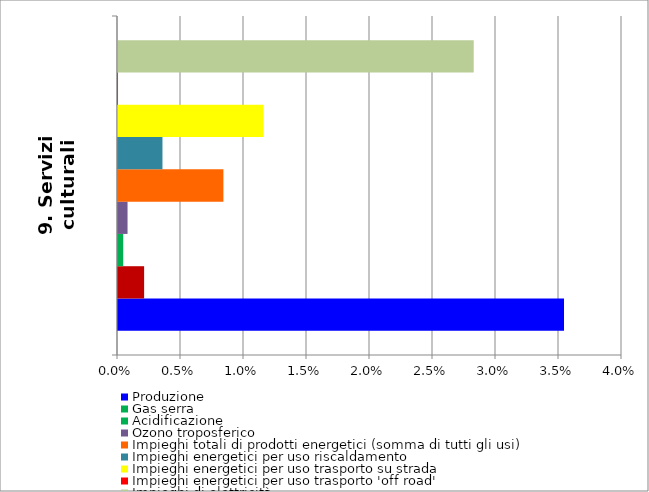
| Category | Produzione | Gas serra | Acidificazione | Ozono troposferico | Impieghi totali di prodotti energetici (somma di tutti gli usi) | Impieghi energetici per uso riscaldamento | Impieghi energetici per uso trasporto su strada | Impieghi energetici per uso trasporto 'off road' | Impieghi di elettricità |
|---|---|---|---|---|---|---|---|---|---|
| 9. Servizi culturali | 0.035 | 0.002 | 0 | 0.001 | 0.008 | 0.004 | 0.012 | 0 | 0.028 |